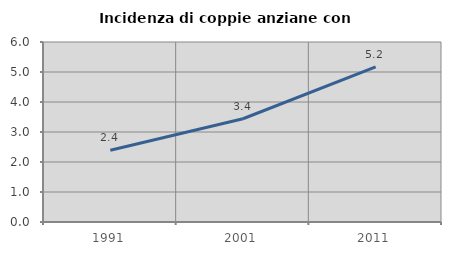
| Category | Incidenza di coppie anziane con figli |
|---|---|
| 1991.0 | 2.39 |
| 2001.0 | 3.441 |
| 2011.0 | 5.172 |